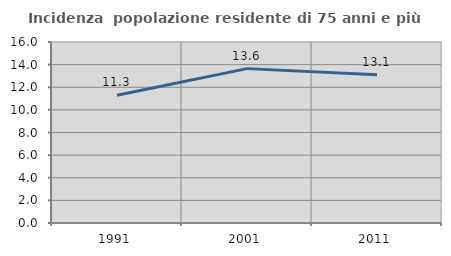
| Category | Incidenza  popolazione residente di 75 anni e più |
|---|---|
| 1991.0 | 11.294 |
| 2001.0 | 13.647 |
| 2011.0 | 13.095 |